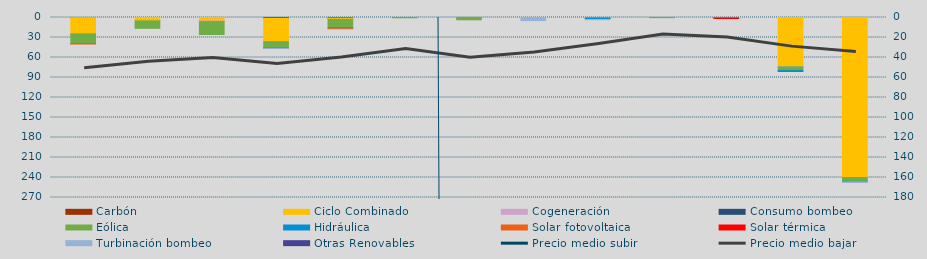
| Category | Carbón | Ciclo Combinado | Cogeneración | Consumo bombeo | Eólica | Hidráulica | Solar fotovoltaica | Solar térmica | Turbinación bombeo | Otras Renovables |
|---|---|---|---|---|---|---|---|---|---|---|
| 0 | 167 | 24469.7 | 4.5 |  | 14472.2 | 627.8 | 21.8 | 0 | 0 | 0 |
| 1 | 0 | 4989.5 | 0 |  | 11218.3 | 8.9 | 0 | 0 | 0 | 0 |
| 2 | 0 | 5246.6 | 891.5 |  | 19357.7 | 73 | 0 | 0 | 0 | 0 |
| 3 | 1161 | 34847 | 340.9 |  | 9473.4 | 120 | 21.4 | 39.8 | 400 | 0 |
| 4 | 846 | 1898.8 | 0 |  | 12932.4 | 1173 | 33 | 0 | 0 | 80 |
| 5 | 0 | 0 | 0 |  | 464.6 | 0 | 0 | 0 | 0 | 0 |
| 6 | 0 | 0 | 0 |  | 3444.7 | 0 | 0 | 0 | 0 | 0 |
| 7 | 0 | 0 | 0 |  | 0 | 0 | 0 | 0 | 4657.9 | 0 |
| 8 | 0 | 0 | 0 |  | 1293.6 | 1910.2 | 0 | 0 | 100 | 0 |
| 9 | 0 | 0 | 0 |  | 227.5 | 0 | 0 | 0 | 0 | 0 |
| 10 | 0 | 0 | 0 |  | 0 | 946.5 | 61.6 | 516 | 0 | 0 |
| 11 | 0 | 73835.8 | 271.4 |  | 5567.4 | 2850.8 | 0 | 0 | 0 | 0 |
| 12 | 0 | 239981.7 | 135.5 |  | 5593.5 | 740.7 | 320.4 | 0 | 640 | 0 |